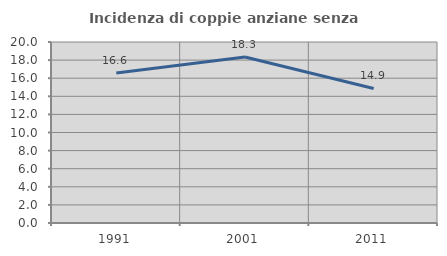
| Category | Incidenza di coppie anziane senza figli  |
|---|---|
| 1991.0 | 16.575 |
| 2001.0 | 18.34 |
| 2011.0 | 14.862 |